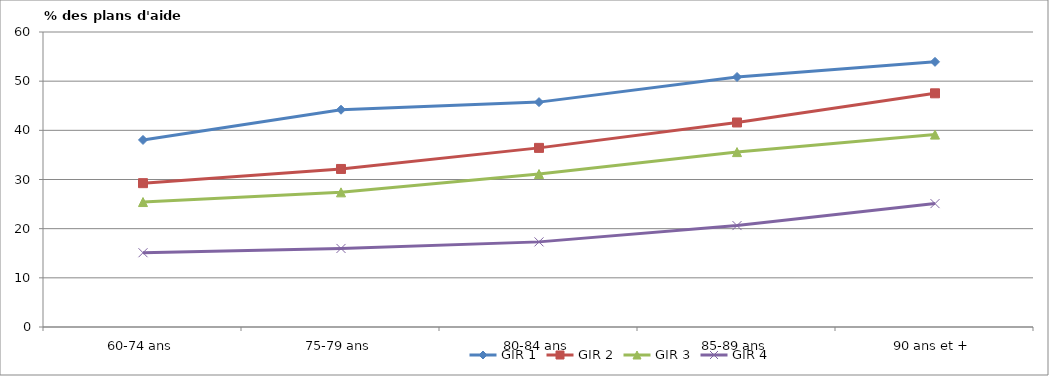
| Category | GIR 1 | GIR 2 | GIR 3 | GIR 4 |
|---|---|---|---|---|
| 60-74 ans | 38.044 | 29.255 | 25.415 | 15.107 |
| 75-79 ans | 44.188 | 32.144 | 27.388 | 15.973 |
| 80-84 ans | 45.74 | 36.432 | 31.112 | 17.313 |
| 85-89 ans | 50.847 | 41.6 | 35.572 | 20.631 |
| 90 ans et + | 53.928 | 47.527 | 39.129 | 25.098 |